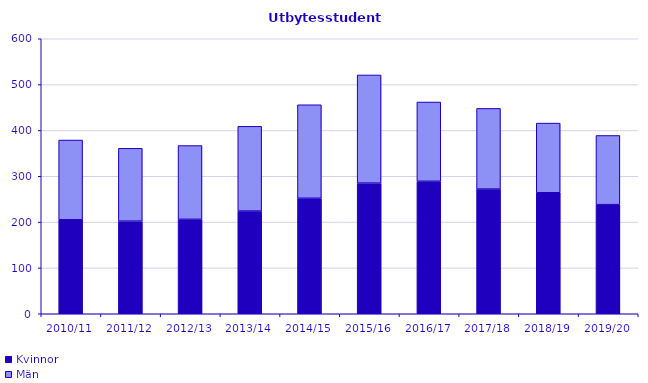
| Category | Kvinnor | Män |
|---|---|---|
| 2010/11 | 205 | 174 |
| 2011/12 | 202 | 159 |
| 2012/13 | 206 | 161 |
| 2013/14 | 224 | 185 |
| 2014/15 | 252 | 204 |
| 2015/16 | 285 | 236 |
| 2016/17 | 289 | 173 |
| 2017/18 | 272 | 176 |
| 2018/19 | 264 | 152 |
| 2019/20 | 238 | 151 |